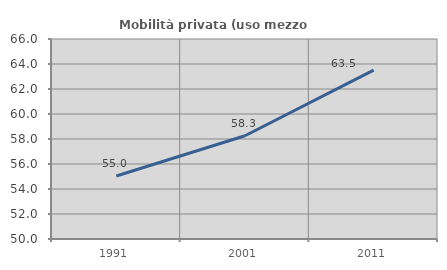
| Category | Mobilità privata (uso mezzo privato) |
|---|---|
| 1991.0 | 55.039 |
| 2001.0 | 58.261 |
| 2011.0 | 63.514 |